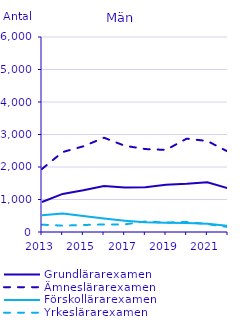
| Category | Grundlärarexamen                                   | Ämneslärarexamen                                   | Förskollärarexamen                                 | Yrkeslärarexamen                                   |
|---|---|---|---|---|
| 2013 | 924 | 1940 | 513 | 225 |
| 2014 | 1171 | 2460 | 569 | 196 |
| 2015 | 1283 | 2637 | 490 | 216 |
| 2016 | 1415 | 2901 | 415 | 231 |
| 2017 | 1370 | 2654 | 349 | 235 |
| 2018 | 1374 | 2552 | 297 | 322 |
| 2019 | 1453 | 2526 | 283 | 290 |
| 2020 | 1483 | 2872 | 279 | 310 |
| 2021 | 1529 | 2800 | 253 | 243 |
| 2022 | 1347 | 2471 | 189 | 154 |